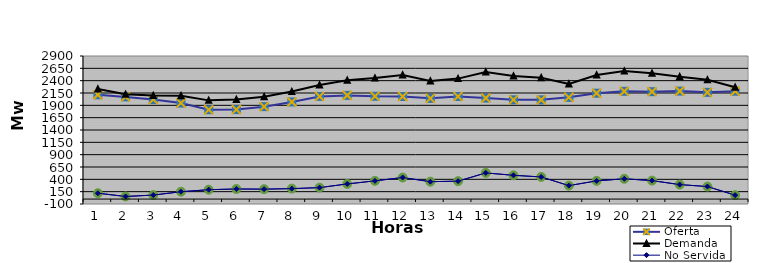
| Category | Oferta | No Servida | Demanda |
|---|---|---|---|
| 1.0 | 2113.44 | 118.628 | 2232.068 |
| 2.0 | 2071.2 | 52.42 | 2123.62 |
| 3.0 | 2018.25 | 80.927 | 2099.177 |
| 4.0 | 1946.15 | 148.845 | 2094.995 |
| 5.0 | 1810.54 | 190.095 | 2000.635 |
| 6.0 | 1813.95 | 204.394 | 2018.344 |
| 7.0 | 1873.61 | 201.095 | 2074.705 |
| 8.0 | 1968.69 | 211.678 | 2180.368 |
| 9.0 | 2081.07 | 231.744 | 2312.814 |
| 10.0 | 2101.7 | 306.482 | 2408.182 |
| 11.0 | 2083.74 | 369.211 | 2452.951 |
| 12.0 | 2078.47 | 436.636 | 2515.106 |
| 13.0 | 2041.2 | 352.375 | 2393.575 |
| 14.0 | 2078.77 | 362.986 | 2441.756 |
| 15.0 | 2047.18 | 530.192 | 2577.372 |
| 16.0 | 2012.06 | 481.593 | 2493.653 |
| 17.0 | 2011.15 | 448.483 | 2459.633 |
| 18.0 | 2061.79 | 272.585 | 2334.375 |
| 19.0 | 2146.02 | 368.9 | 2514.92 |
| 20.0 | 2183.62 | 410.947 | 2594.567 |
| 21.0 | 2176.75 | 374.396 | 2551.146 |
| 22.0 | 2188.21 | 293.238 | 2481.448 |
| 23.0 | 2162.91 | 253.647 | 2416.557 |
| 24.0 | 2185.91 | 79.19 | 2265.1 |